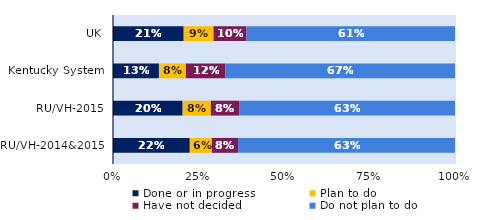
| Category | Done or in progress | Plan to do | Have not decided | Do not plan to do |
|---|---|---|---|---|
| UK | 0.207 | 0.087 | 0.096 | 0.61 |
| Kentucky System | 0.134 | 0.079 | 0.116 | 0.671 |
| RU/VH-2015 | 0.204 | 0.082 | 0.083 | 0.631 |
| RU/VH-2014&2015 | 0.225 | 0.064 | 0.077 | 0.634 |